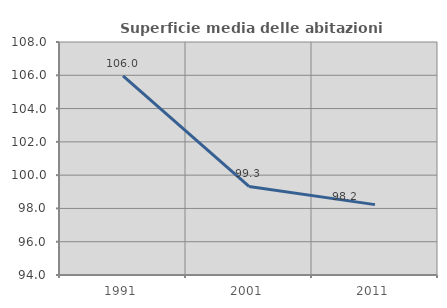
| Category | Superficie media delle abitazioni occupate |
|---|---|
| 1991.0 | 105.962 |
| 2001.0 | 99.32 |
| 2011.0 | 98.228 |